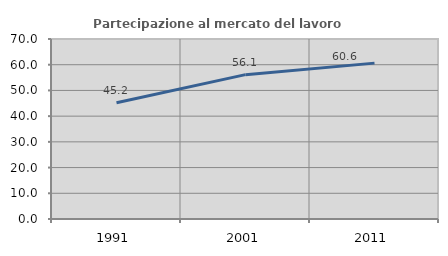
| Category | Partecipazione al mercato del lavoro  femminile |
|---|---|
| 1991.0 | 45.182 |
| 2001.0 | 56.133 |
| 2011.0 | 60.618 |